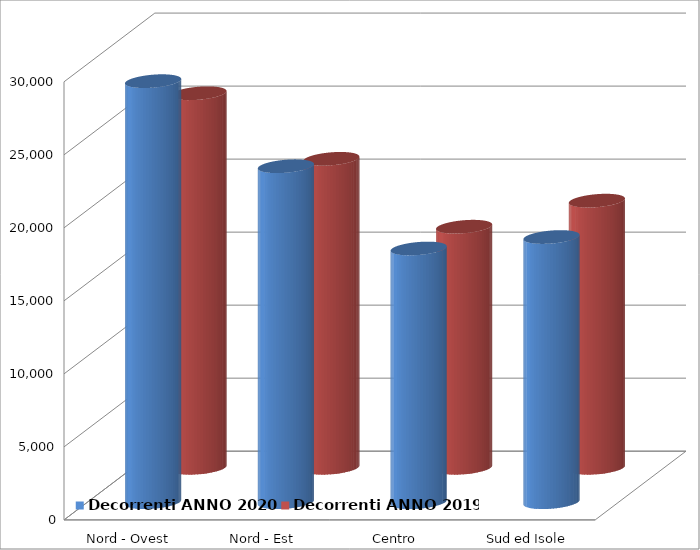
| Category | Decorrenti ANNO 2020 | Decorrenti ANNO 2019 |
|---|---|---|
| Nord - Ovest | 28831 | 25650 |
| Nord - Est | 23005 | 21159 |
| Centro | 17372 | 16510 |
| Sud ed Isole | 18158 | 18295 |